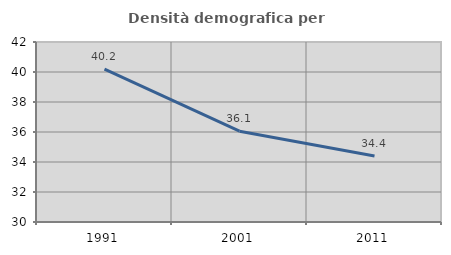
| Category | Densità demografica |
|---|---|
| 1991.0 | 40.187 |
| 2001.0 | 36.052 |
| 2011.0 | 34.4 |